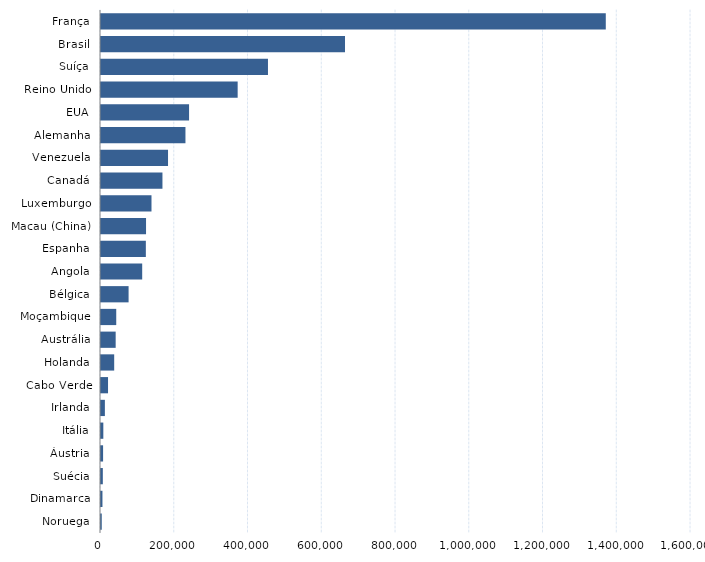
| Category | Series 0 |
|---|---|
| Noruega | 2032 |
| Dinamarca | 3943 |
| Suécia | 4953 |
| Áustria | 5670 |
| Itália | 6299 |
| Irlanda | 10516 |
| Cabo Verde | 19076 |
| Holanda | 35779 |
| Austrália | 39780 |
| Moçambique | 41344 |
| Bélgica | 74807 |
| Angola | 111718 |
| Espanha | 121617 |
| Macau (China) | 122157 |
| Luxemburgo | 136918 |
| Canadá | 166651 |
| Venezuela | 181785 |
| Alemanha | 229033 |
| EUA | 238824 |
| Reino Unido | 370603 |
| Suíça | 452806 |
| Brasil | 661721 |
| França | 1368914 |